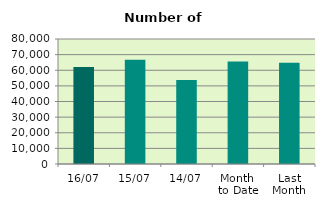
| Category | Series 0 |
|---|---|
| 16/07 | 62008 |
| 15/07 | 66684 |
| 14/07 | 53756 |
| Month 
to Date | 65677.167 |
| Last
Month | 64737.364 |